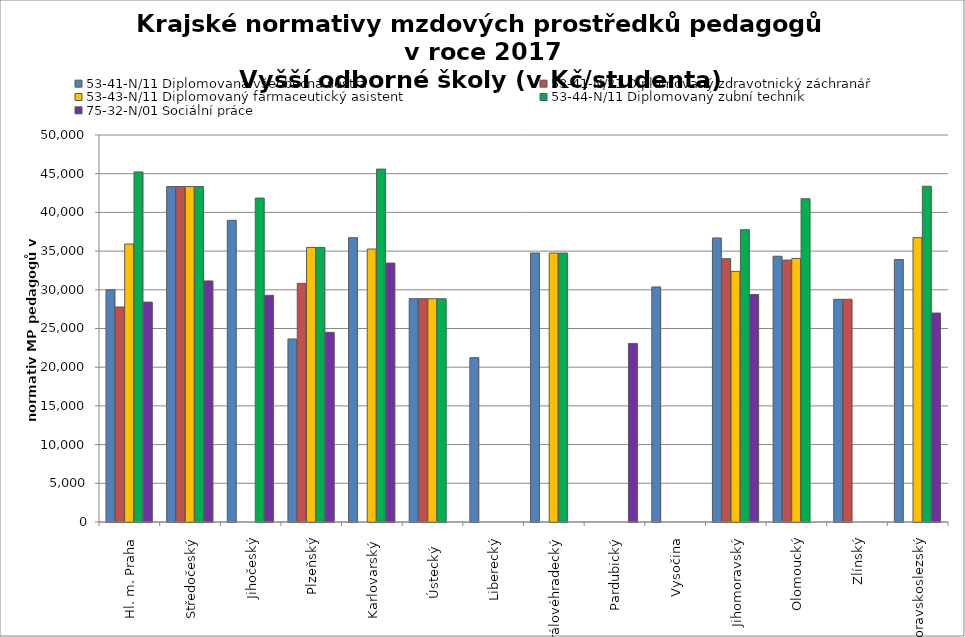
| Category | 53-41-N/11 Diplomovaná všeobecná sestra | 53-41-N/21 Diplomovaný zdravotnický záchranář | 53-43-N/11 Diplomovaný farmaceutický asistent | 53-44-N/11 Diplomovaný zubní technik | 75-32-N/01 Sociální práce |
|---|---|---|---|---|---|
| Hl. m. Praha | 30000 | 27777.778 | 35919.54 | 45235.223 | 28409.091 |
| Středočeský | 43341.34 | 43341.34 | 43341.34 | 43341.34 | 31152.375 |
| Jihočeský | 38979.367 | 0 | 0 | 41852.995 | 29289.836 |
| Plzeňský | 23647.238 | 30831.457 | 35470.857 | 35470.857 | 24502.895 |
| Karlovarský  | 36726.886 | 0 | 35265.306 | 45593.668 | 33455.954 |
| Ústecký   | 28851 | 28851 | 28851 | 28851 | 0 |
| Liberecký | 21232.994 | 0 | 0 | 0 | 0 |
| Královéhradecký | 34750.973 | 0 | 34750.973 | 34750.973 | 0 |
| Pardubický | 0 | 0 | 0 | 0 | 23069.689 |
| Vysočina | 30371.045 | 0 | 0 | 0 | 0 |
| Jihomoravský | 36695.177 | 34018.404 | 32378.825 | 37762.568 | 29386.347 |
| Olomoucký | 34335.413 | 33838.698 | 34054.231 | 41769.643 | 0 |
| Zlínský | 28775 | 28775 | 0 | 0 | 0 |
| Moravskoslezský | 33908.257 | 0 | 36739.563 | 43380.282 | 26997.809 |